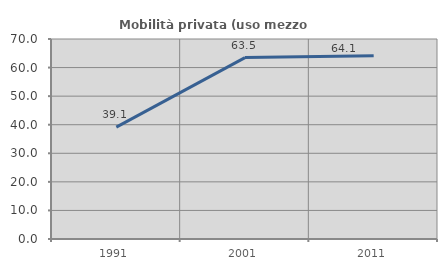
| Category | Mobilità privata (uso mezzo privato) |
|---|---|
| 1991.0 | 39.139 |
| 2001.0 | 63.491 |
| 2011.0 | 64.104 |